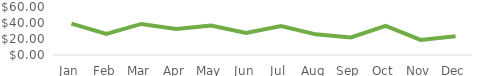
| Category | Cost Per Acquisition |
|---|---|
| Jan | 39.318 |
| Feb | 26.314 |
| Mar | 38.84 |
| Apr | 32.567 |
| May | 36.808 |
| Jun | 27.692 |
| Jul | 36.067 |
| Aug | 25.8 |
| Sep | 21.911 |
| Oct | 36.5 |
| Nov | 18.889 |
| Dec | 23.341 |